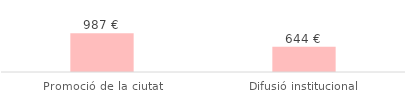
| Category | Total |
|---|---|
| Promoció de la ciutat | 986.88 |
| Difusió institucional | 644.45 |